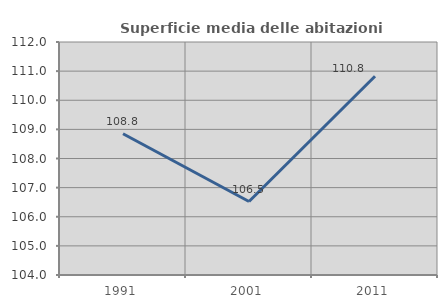
| Category | Superficie media delle abitazioni occupate |
|---|---|
| 1991.0 | 108.85 |
| 2001.0 | 106.523 |
| 2011.0 | 110.823 |